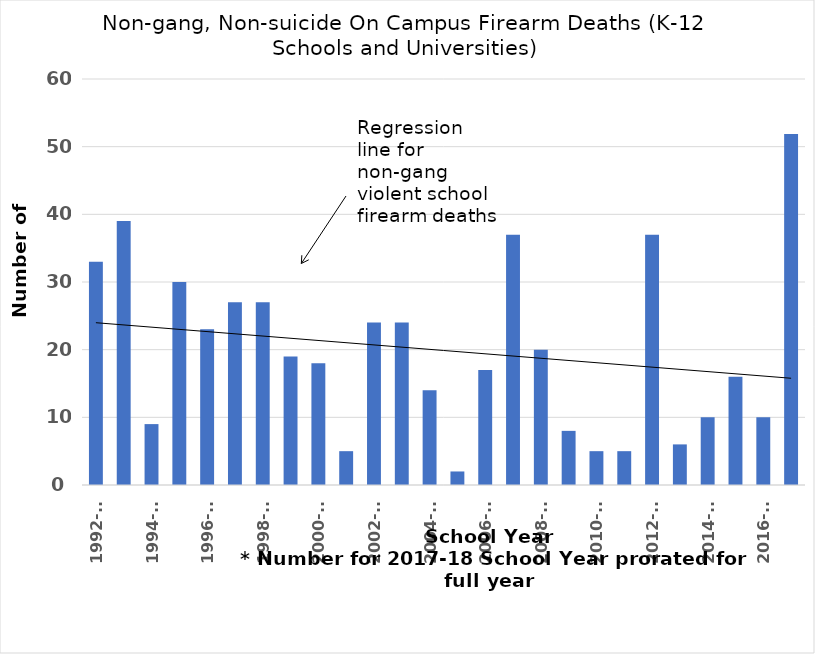
| Category | K12 and Universities |
|---|---|
| 1992-93 | 33 |
| 1993-94 | 39 |
| 1994-95 | 9 |
| 1995-96 | 30 |
| 1996-97 | 23 |
| 1997-98 | 27 |
| 1998-99 | 27 |
| 1999-00 | 19 |
| 2000-01 | 18 |
| 2001-02 | 5 |
| 2002-03 | 24 |
| 2003-04 | 24 |
| 2004-05 | 14 |
| 2005-06 | 2 |
| 2006-07 | 17 |
| 2007-08 | 37 |
| 2008-09 | 20 |
| 2009-10 | 8 |
| 2010-11 | 5 |
| 2011-12 | 5 |
| 2012-13 | 37 |
| 2013-14 | 6 |
| 2014-15 | 10 |
| 2015-16 | 16 |
| 2016-17 | 10 |
| 2017 to Feb.14, 2018* | 51.857 |